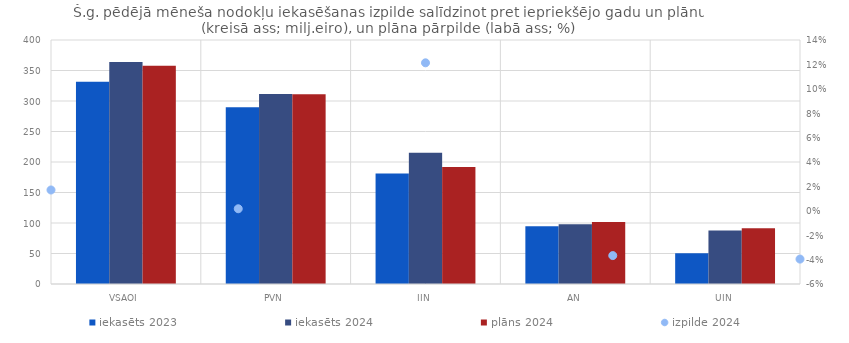
| Category | iekasēts 2023 | iekasēts 2024 | plāns 2024 |
|---|---|---|---|
| VSAOI | 331.367 | 364.078 | 357.971 |
| PVN | 289.733 | 311.421 | 310.9 |
| IIN | 181.073 | 215.29 | 192 |
| AN | 94.582 | 97.762 | 101.488 |
| UIN | 50.345 | 87.686 | 91.3 |